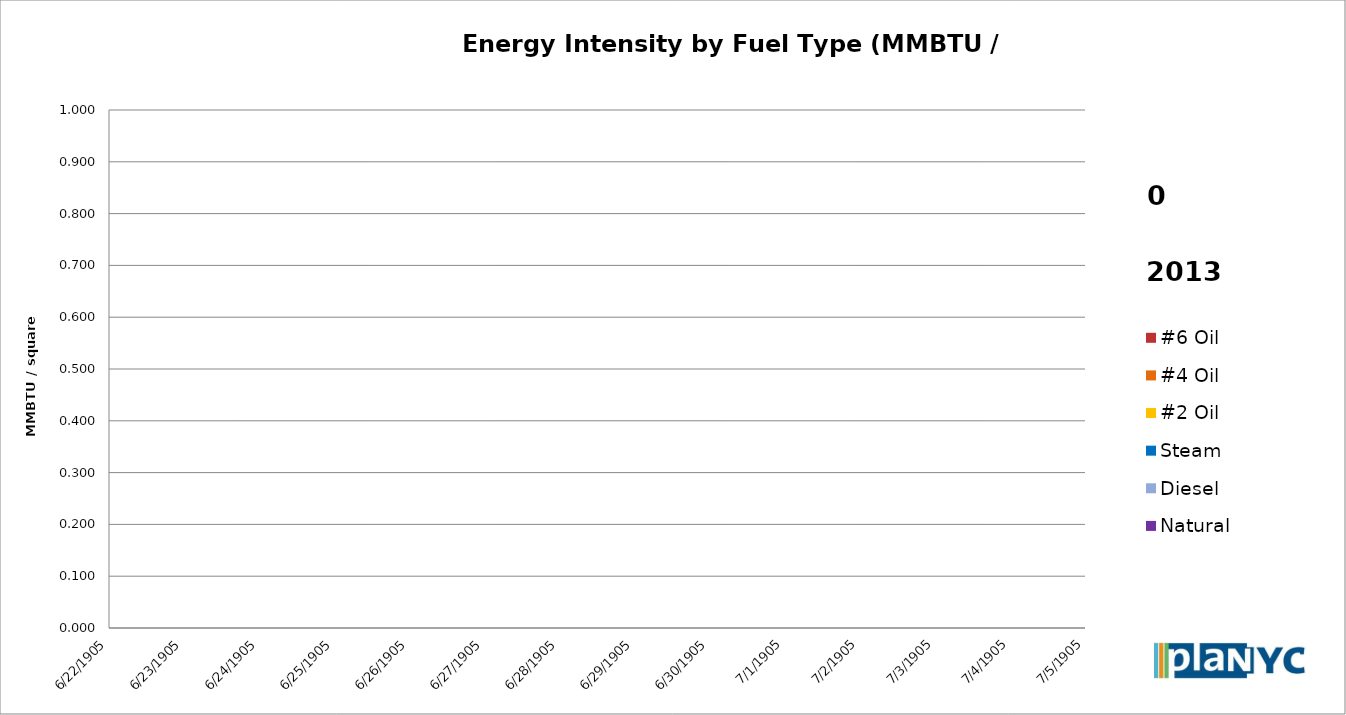
| Category | Electricity | Natural Gas | Diesel | Steam | #2 Oil | #4 Oil | #6 Oil |
|---|---|---|---|---|---|---|---|
| 2000.0 | 0 | 0 | 0 | 0 | 0 | 0 | 0 |
| 2001.0 | 0 | 0 | 0 | 0 | 0 | 0 | 0 |
| 2002.0 | 0 | 0 | 0 | 0 | 0 | 0 | 0 |
| 2003.0 | 0 | 0 | 0 | 0 | 0 | 0 | 0 |
| 2004.0 | 0 | 0 | 0 | 0 | 0 | 0 | 0 |
| 2005.0 | 0 | 0 | 0 | 0 | 0 | 0 | 0 |
| 2006.0 | 0 | 0 | 0 | 0 | 0 | 0 | 0 |
| 2007.0 | 0 | 0 | 0 | 0 | 0 | 0 | 0 |
| 2008.0 | 0 | 0 | 0 | 0 | 0 | 0 | 0 |
| 2009.0 | 0 | 0 | 0 | 0 | 0 | 0 | 0 |
| 2010.0 | 0 | 0 | 0 | 0 | 0 | 0 | 0 |
| 2011.0 | 0 | 0 | 0 | 0 | 0 | 0 | 0 |
| 2012.0 | 0 | 0 | 0 | 0 | 0 | 0 | 0 |
| 2013.0 | 0 | 0 | 0 | 0 | 0 | 0 | 0 |